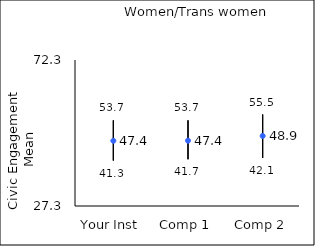
| Category | 25th percentile | 75th percentile | Mean |
|---|---|---|---|
| Your Inst | 41.3 | 53.7 | 47.4 |
| Comp 1 | 41.7 | 53.7 | 47.44 |
| Comp 2 | 42.1 | 55.5 | 48.89 |